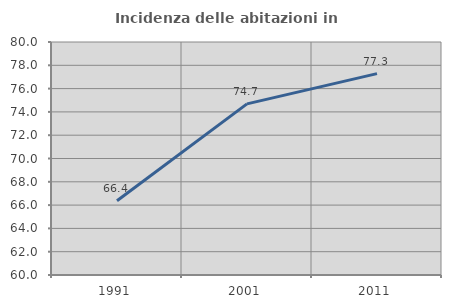
| Category | Incidenza delle abitazioni in proprietà  |
|---|---|
| 1991.0 | 66.369 |
| 2001.0 | 74.69 |
| 2011.0 | 77.285 |